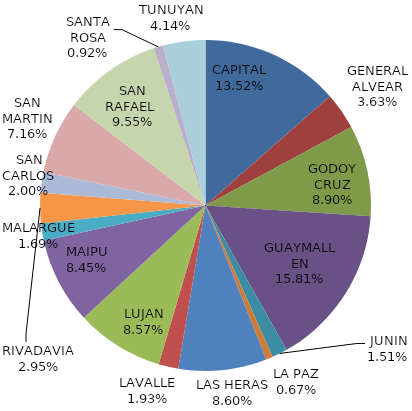
| Category | Total Quiniela Recaudación  |
|---|---|
| CAPITAL | 15245905 |
| GENERAL ALVEAR | 4089268 |
| GODOY CRUZ | 10030444 |
| GUAYMALLEN | 17823300 |
| JUNIN | 1698248 |
| LA PAZ | 758925 |
| LAS HERAS | 9699173 |
| LAVALLE | 2180705 |
| LUJAN | 9661519 |
| MAIPU | 9531159 |
| MALARGUE | 1901023 |
| RIVADAVIA | 3330138 |
| SAN CARLOS | 2253752 |
| SAN MARTIN | 8071964 |
| SAN RAFAEL  | 10771701 |
| SANTA ROSA | 1033990 |
| TUNUYAN | 4672020 |